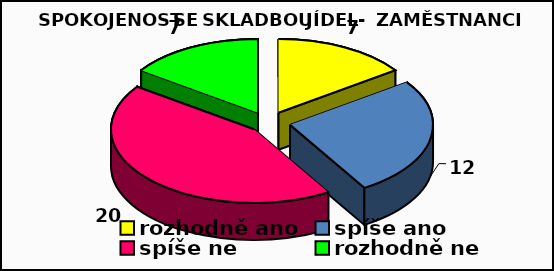
| Category | Series 0 |
|---|---|
| rozhodně ano | 7 |
| spíše ano | 12 |
| spíše ne | 20 |
| rozhodně ne | 7 |